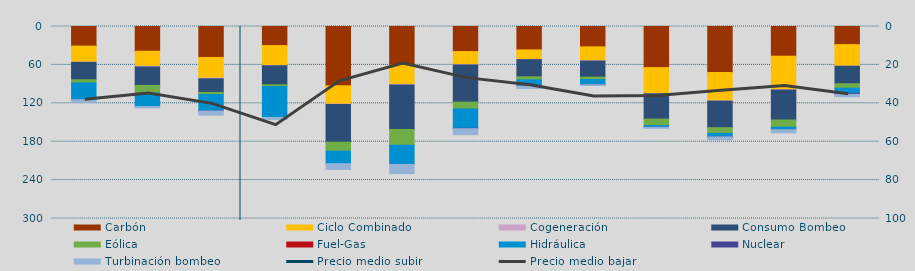
| Category | Carbón | Ciclo Combinado | Cogeneración | Consumo Bombeo | Eólica | Fuel-Gas | Hidráulica | Nuclear | Turbinación bombeo |
|---|---|---|---|---|---|---|---|---|---|
| O | 30606.2 | 25077.2 | 351.5 | 27192.1 | 4972 | 0 | 25903.4 | 171.9 | 4234.4 |
| N | 38654 | 23471.9 | 1088.5 | 28952.2 | 12138.1 | 0 | 20858.9 | 0 | 1910.4 |
| D | 48332.5 | 32343 | 1137.1 | 21197.2 | 3426.7 | 0 | 25403.7 | 222 | 6361.9 |
| E | 29873.4 | 31257.5 | 232.7 | 29718.6 | 2813.5 | 0 | 48230.3 | 0 | 3337.1 |
| F | 92635.5 | 28594.2 | 463.1 | 59071.9 | 13978.3 | 0 | 19654.8 | 0 | 9063.5 |
| M | 60556.8 | 29853.7 | 1006.6 | 69541.7 | 24572.7 | 0 | 29936.2 | 30 | 14315.8 |
| A | 39185.7 | 20218.6 | 667 | 58045.1 | 10784.5 | 0 | 30176.3 | 635.3 | 9263.7 |
| M | 36573.1 | 14965.8 | 259.5 | 26811.1 | 4780.9 | 0 | 9611.3 | 138 | 3683.8 |
| J | 31856.5 | 21784.2 | 332.6 | 25120.8 | 3742.7 | 0 | 7869.8 | 320 | 1244.9 |
| J | 64224.4 | 40730.5 | 223.6 | 39459.7 | 10048.7 | 0 | 2606.4 | 130 | 1680.4 |
| A | 71875.8 | 44407.8 | 356.8 | 41443.4 | 8916.4 | 0 | 5181.1 | 179.2 | 4517 |
| S | 46377.5 | 52485.1 | 420.2 | 46799.1 | 11262.5 | 0 | 3698.4 | 178.3 | 4969.7 |
| O | 28352.7 | 33701.8 | 72.5 | 27285.6 | 6968.9 | 0 | 8057.2 | 1524.1 | 3817.1 |